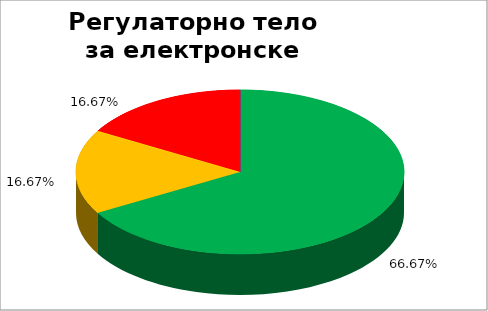
| Category | Регулаторно тело за електронске медије  |
|---|---|
| 0 | 0.667 |
| 1 | 0.167 |
| 2 | 0 |
| 3 | 0.167 |
| 4 | 0 |